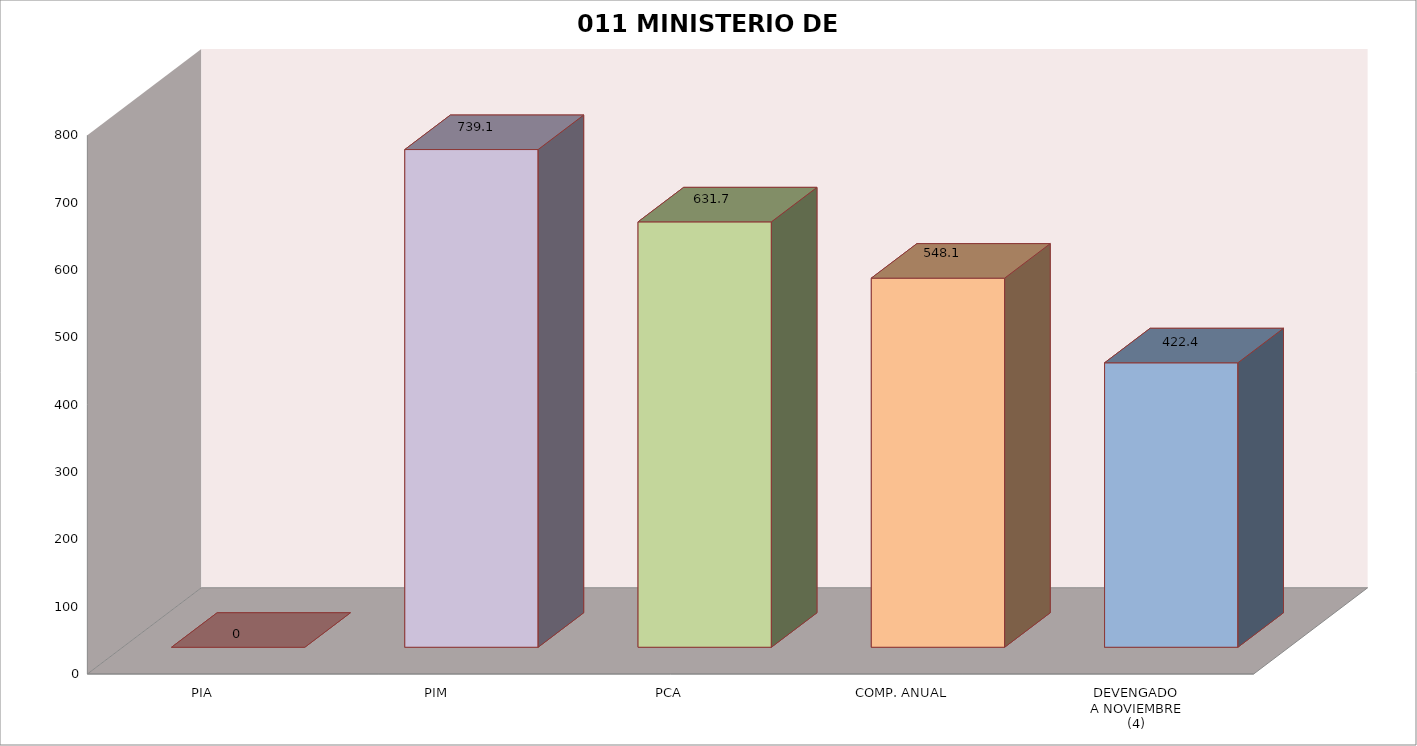
| Category | 011 MINISTERIO DE SALUD |
|---|---|
| PIA | 0 |
| PIM | 739.052 |
| PCA | 631.675 |
| COMP. ANUAL | 548.098 |
| DEVENGADO
A NOVIEMBRE
(4) | 422.394 |